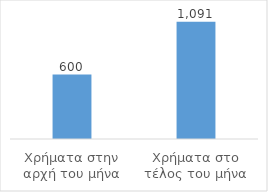
| Category | Series 0 |
|---|---|
| Χρήματα στην αρχή του μήνα | 600 |
| Χρήματα στο τέλος του μήνα | 1091 |